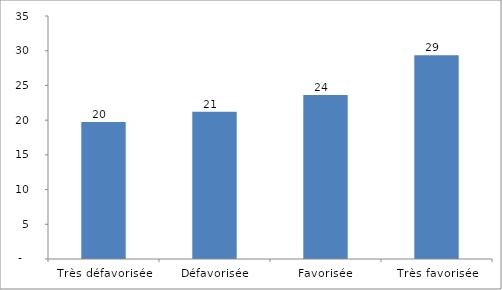
| Category | SEP scolaire |
|---|---|
| Très défavorisée | 19.716 |
| Défavorisée | 21.22 |
| Favorisée | 23.631 |
| Très favorisée | 29.338 |